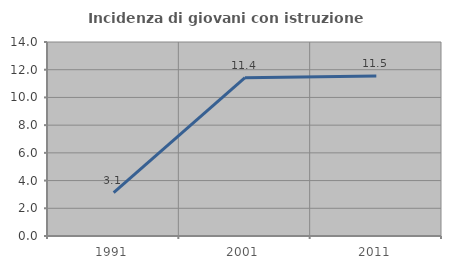
| Category | Incidenza di giovani con istruzione universitaria |
|---|---|
| 1991.0 | 3.125 |
| 2001.0 | 11.429 |
| 2011.0 | 11.538 |